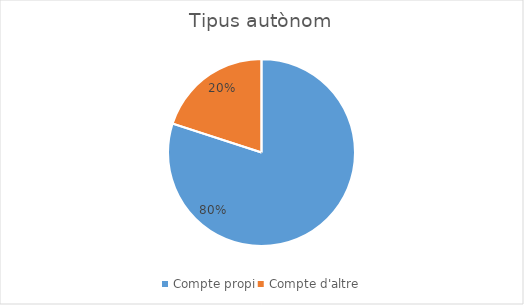
| Category | Series 0 |
|---|---|
| Compte propi | 4 |
| Compte d'altre | 1 |